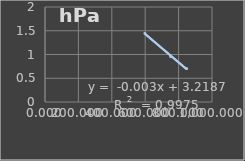
| Category | Presión Atmosférica |
|---|---|
| 598.117 | 1.445 |
| 752.816 | 0.954 |
| 848.553 | 0.704 |